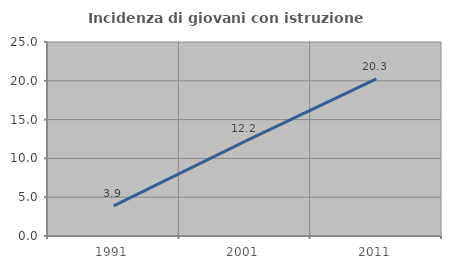
| Category | Incidenza di giovani con istruzione universitaria |
|---|---|
| 1991.0 | 3.871 |
| 2001.0 | 12.195 |
| 2011.0 | 20.253 |